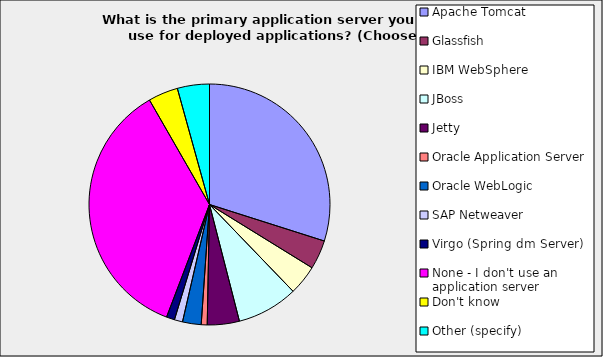
| Category | Series 0 |
|---|---|
| Apache Tomcat | 0.299 |
| Glassfish | 0.039 |
| IBM WebSphere | 0.04 |
| JBoss | 0.082 |
| Jetty | 0.043 |
| Oracle Application Server | 0.008 |
| Oracle WebLogic | 0.025 |
| SAP Netweaver | 0.011 |
| Virgo (Spring dm Server) | 0.011 |
| None - I don't use an application server | 0.359 |
| Don't know | 0.04 |
| Other (specify) | 0.043 |